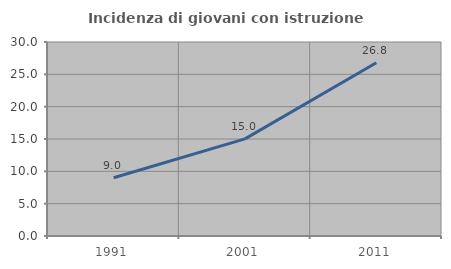
| Category | Incidenza di giovani con istruzione universitaria |
|---|---|
| 1991.0 | 9.009 |
| 2001.0 | 15.012 |
| 2011.0 | 26.796 |